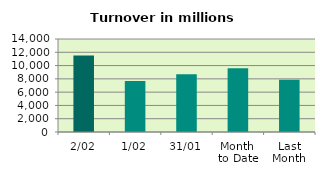
| Category | Series 0 |
|---|---|
| 2/02 | 11519.034 |
| 1/02 | 7683.213 |
| 31/01 | 8707.941 |
| Month 
to Date | 9601.124 |
| Last
Month | 7855.802 |